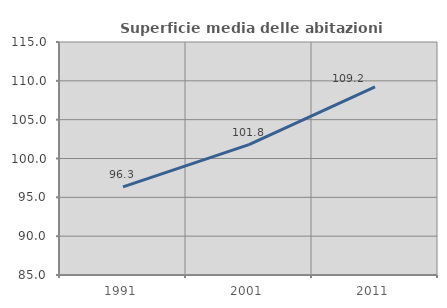
| Category | Superficie media delle abitazioni occupate |
|---|---|
| 1991.0 | 96.34 |
| 2001.0 | 101.779 |
| 2011.0 | 109.211 |